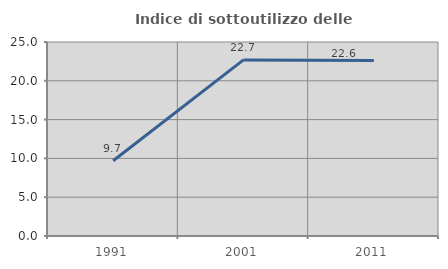
| Category | Indice di sottoutilizzo delle abitazioni  |
|---|---|
| 1991.0 | 9.69 |
| 2001.0 | 22.689 |
| 2011.0 | 22.613 |